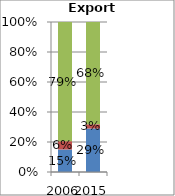
| Category | Agriculture | Fuels and mining | Manufacturing |
|---|---|---|---|
| 2006.0 | 0.15 | 0.055 | 0.795 |
| 2015.0 | 0.29 | 0.028 | 0.682 |